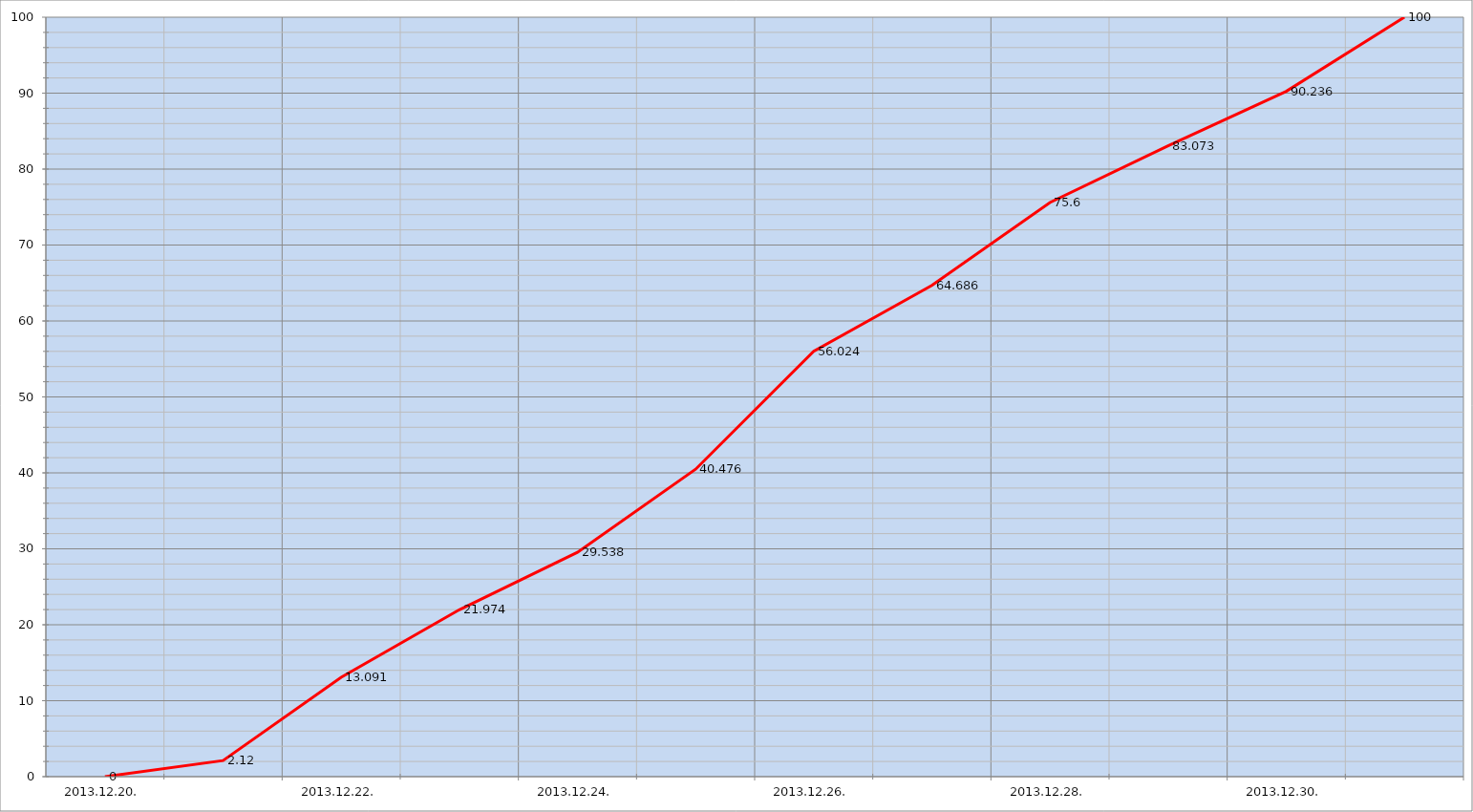
| Category | Szerver 4 |
|---|---|
| 2013-12-20 | 0 |
| 2013-12-21 | 2.12 |
| 2013-12-22 | 13.091 |
| 2013-12-23 | 21.974 |
| 2013-12-24 | 29.538 |
| 2013-12-25 | 40.476 |
| 2013-12-26 | 56.024 |
| 2013-12-27 | 64.686 |
| 2013-12-28 | 75.6 |
| 2013-12-29 | 83.073 |
| 2013-12-30 | 90.236 |
| 2013-12-31 | 100 |